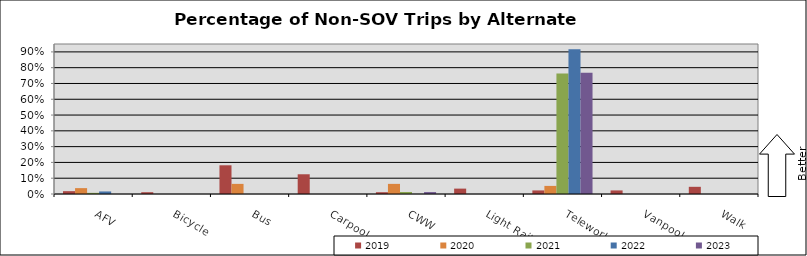
| Category | 2019 | 2020 | 2021 | 2022 | 2023 |
|---|---|---|---|---|---|
| AFV | 0.018 | 0.037 | 0.007 | 0.016 | 0 |
| Bicycle | 0.011 | 0 | 0 | 0 | 0 |
| Bus | 0.182 | 0.064 | 0 | 0 | 0 |
| Carpool | 0.125 | 0 | 0 | 0 | 0 |
| CWW | 0.011 | 0.064 | 0.012 | 0 | 0.012 |
| Light Rail | 0.034 | 0 | 0 | 0 | 0 |
| Telework | 0.023 | 0.051 | 0.762 | 0.917 | 0.768 |
| Vanpool | 0.023 | 0 | 0 | 0 | 0 |
| Walk | 0.046 | 0 | 0 | 0 | 0 |